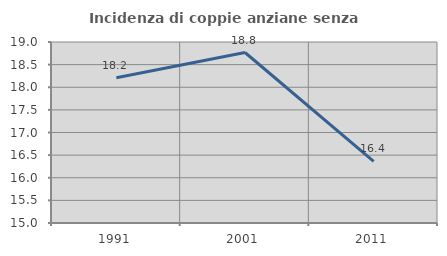
| Category | Incidenza di coppie anziane senza figli  |
|---|---|
| 1991.0 | 18.208 |
| 2001.0 | 18.768 |
| 2011.0 | 16.364 |